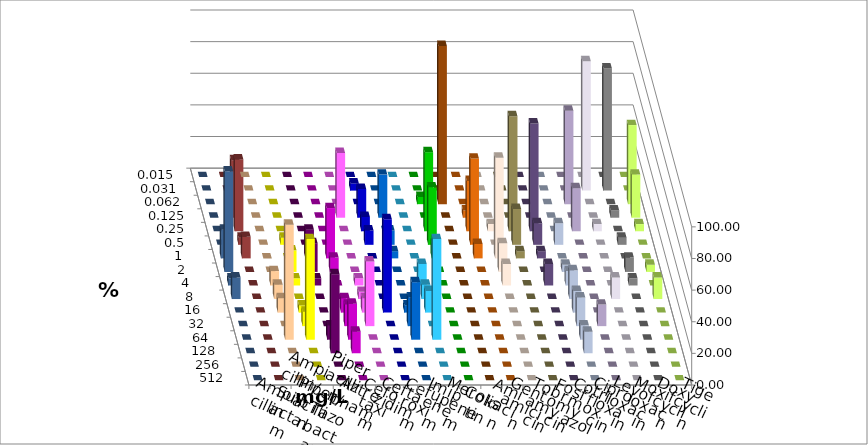
| Category | Ampicillin | Ampicillin/ Sulbactam | Piperacillin | Piperacillin/ Tazobactam | Aztreonam | Cefotaxim | Ceftazidim | Cefuroxim | Imipenem | Meropenem | Colistin | Amikacin | Gentamicin | Tobramycin | Fosfomycin | Cotrimoxazol | Ciprofloxacin | Levofloxacin | Moxifloxacin | Doxycyclin | Tigecyclin |
|---|---|---|---|---|---|---|---|---|---|---|---|---|---|---|---|---|---|---|---|---|---|
| 0.015 | 0 | 0 | 0 | 0 | 0 | 0 | 0 | 0 | 0 | 0 | 0 | 0 | 0 | 0 | 0 | 0 | 0 | 0 | 0 | 0 | 0 |
| 0.031 | 0 | 0 | 0 | 0 | 0 | 4.545 | 0 | 0 | 0 | 0 | 0 | 0 | 0 | 0 | 0 | 0 | 81.818 | 77.273 | 0 | 0 | 0 |
| 0.062 | 0 | 0 | 0 | 0 | 0 | 0 | 0 | 0 | 4.545 | 100 | 0 | 0 | 0 | 0 | 0 | 59.091 | 0 | 0 | 50 | 0 | 0 |
| 0.125 | 0 | 0 | 0 | 0 | 40.909 | 18.182 | 27.273 | 0 | 0 | 0 | 4.545 | 0 | 0 | 0 | 0 | 0 | 0 | 4.545 | 27.273 | 0 | 36.364 |
| 0.25 | 0 | 0 | 0 | 0 | 0 | 9.091 | 0 | 0 | 50 | 0 | 31.818 | 4.545 | 72.727 | 68.182 | 0 | 27.273 | 4.545 | 0 | 4.545 | 0 | 45.455 |
| 0.5 | 0 | 4.545 | 0 | 0 | 0 | 9.091 | 9.091 | 0 | 36.364 | 0 | 54.545 | 0 | 22.727 | 13.636 | 13.636 | 0 | 0 | 4.545 | 0 | 0 | 4.545 |
| 1.0 | 0 | 0 | 18.182 | 31.818 | 0 | 0 | 4.545 | 0 | 9.091 | 0 | 9.091 | 63.636 | 4.545 | 4.545 | 0 | 0 | 0 | 0 | 0 | 18.182 | 13.636 |
| 2.0 | 0 | 13.636 | 18.182 | 9.091 | 0 | 0 | 0 | 0 | 0 | 0 | 0 | 18.182 | 0 | 0 | 4.545 | 0 | 0 | 9.091 | 4.545 | 63.636 | 0 |
| 4.0 | 9.091 | 4.545 | 4.545 | 0 | 4.545 | 0 | 0 | 13.636 | 0 | 0 | 0 | 13.636 | 0 | 13.636 | 9.091 | 0 | 0 | 4.545 | 0 | 4.545 | 0 |
| 8.0 | 9.091 | 0 | 0 | 0 | 4.545 | 0 | 0 | 9.091 | 0 | 0 | 0 | 0 | 0 | 0 | 18.182 | 0 | 13.636 | 0 | 13.636 | 13.636 | 0 |
| 16.0 | 9.091 | 4.545 | 0 | 9.091 | 9.091 | 59.091 | 4.545 | 13.636 | 0 | 0 | 0 | 0 | 0 | 0 | 13.636 | 0 | 0 | 0 | 0 | 0 | 0 |
| 32.0 | 0 | 9.091 | 0 | 13.636 | 40.909 | 0 | 18.182 | 0 | 0 | 0 | 0 | 0 | 0 | 0 | 18.182 | 13.636 | 0 | 0 | 0 | 0 | 0 |
| 64.0 | 72.727 | 63.636 | 9.091 | 22.727 | 0 | 0 | 36.364 | 63.636 | 0 | 0 | 0 | 0 | 0 | 0 | 9.091 | 0 | 0 | 0 | 0 | 0 | 0 |
| 128.0 | 0 | 0 | 50 | 13.636 | 0 | 0 | 0 | 0 | 0 | 0 | 0 | 0 | 0 | 0 | 13.636 | 0 | 0 | 0 | 0 | 0 | 0 |
| 256.0 | 0 | 0 | 0 | 0 | 0 | 0 | 0 | 0 | 0 | 0 | 0 | 0 | 0 | 0 | 0 | 0 | 0 | 0 | 0 | 0 | 0 |
| 512.0 | 0 | 0 | 0 | 0 | 0 | 0 | 0 | 0 | 0 | 0 | 0 | 0 | 0 | 0 | 0 | 0 | 0 | 0 | 0 | 0 | 0 |